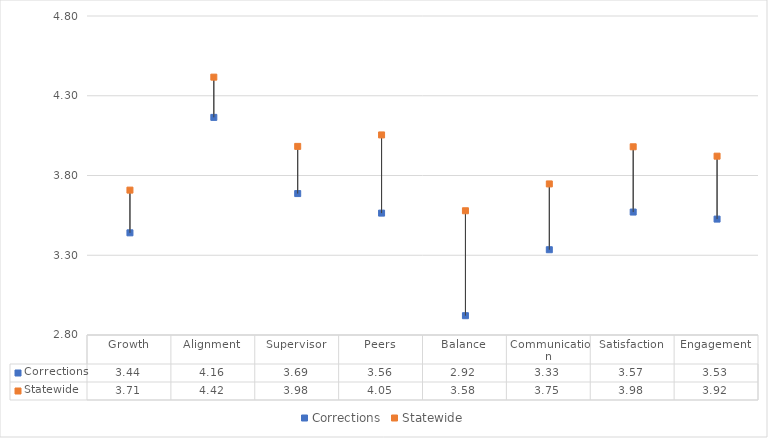
| Category | Corrections | Statewide |
|---|---|---|
| Growth | 3.441 | 3.708 |
| Alignment | 4.164 | 4.417 |
| Supervisor | 3.687 | 3.983 |
| Peers | 3.564 | 4.054 |
| Balance | 2.921 | 3.579 |
| Communication | 3.335 | 3.747 |
| Satisfaction | 3.571 | 3.98 |
| Engagement | 3.527 | 3.921 |